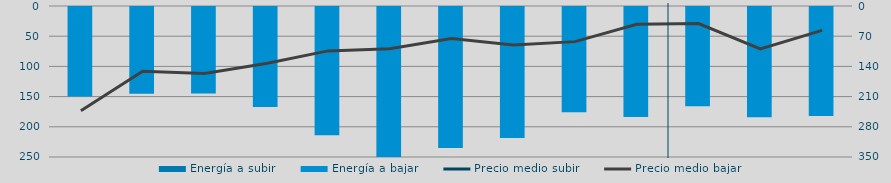
| Category | Energía a subir | Energía a bajar |
|---|---|---|
| M |  | 149.634 |
| A |  | 145.139 |
| M |  | 144.75 |
| J |  | 167.183 |
| J |  | 214.052 |
| A |  | 250.14 |
| S |  | 234.984 |
| O |  | 218.689 |
| N |  | 176.116 |
| D |  | 183.605 |
| E |  | 165.84 |
| F |  | 184.155 |
| M |  | 182.05 |